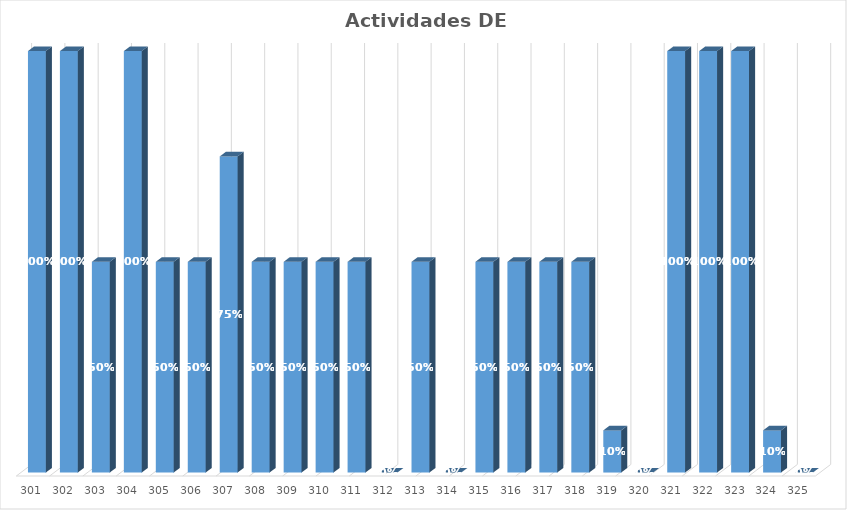
| Category | % Avance |
|---|---|
| 301.0 | 1 |
| 302.0 | 1 |
| 303.0 | 0.5 |
| 304.0 | 1 |
| 305.0 | 0.5 |
| 306.0 | 0.5 |
| 307.0 | 0.75 |
| 308.0 | 0.5 |
| 309.0 | 0.5 |
| 310.0 | 0.5 |
| 311.0 | 0.5 |
| 312.0 | 0 |
| 313.0 | 0.5 |
| 314.0 | 0 |
| 315.0 | 0.5 |
| 316.0 | 0.5 |
| 317.0 | 0.5 |
| 318.0 | 0.5 |
| 319.0 | 0.1 |
| 320.0 | 0 |
| 321.0 | 1 |
| 322.0 | 1 |
| 323.0 | 1 |
| 324.0 | 0.1 |
| 325.0 | 0 |